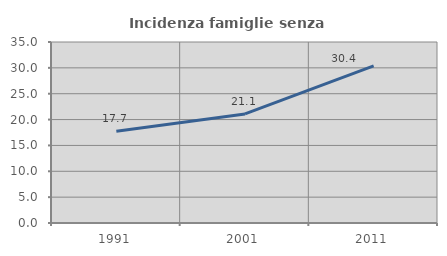
| Category | Incidenza famiglie senza nuclei |
|---|---|
| 1991.0 | 17.731 |
| 2001.0 | 21.092 |
| 2011.0 | 30.376 |